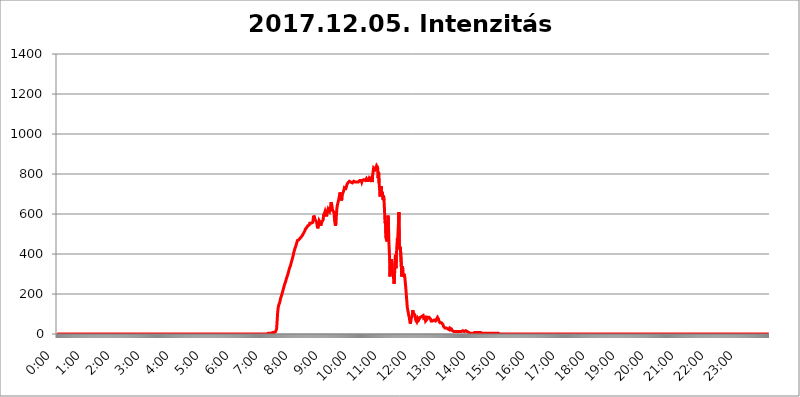
| Category | 2017.12.05. Intenzitás [W/m^2] |
|---|---|
| 0.0 | 0 |
| 0.0006944444444444445 | 0 |
| 0.001388888888888889 | 0 |
| 0.0020833333333333333 | 0 |
| 0.002777777777777778 | 0 |
| 0.003472222222222222 | 0 |
| 0.004166666666666667 | 0 |
| 0.004861111111111111 | 0 |
| 0.005555555555555556 | 0 |
| 0.0062499999999999995 | 0 |
| 0.006944444444444444 | 0 |
| 0.007638888888888889 | 0 |
| 0.008333333333333333 | 0 |
| 0.009027777777777779 | 0 |
| 0.009722222222222222 | 0 |
| 0.010416666666666666 | 0 |
| 0.011111111111111112 | 0 |
| 0.011805555555555555 | 0 |
| 0.012499999999999999 | 0 |
| 0.013194444444444444 | 0 |
| 0.013888888888888888 | 0 |
| 0.014583333333333332 | 0 |
| 0.015277777777777777 | 0 |
| 0.015972222222222224 | 0 |
| 0.016666666666666666 | 0 |
| 0.017361111111111112 | 0 |
| 0.018055555555555557 | 0 |
| 0.01875 | 0 |
| 0.019444444444444445 | 0 |
| 0.02013888888888889 | 0 |
| 0.020833333333333332 | 0 |
| 0.02152777777777778 | 0 |
| 0.022222222222222223 | 0 |
| 0.02291666666666667 | 0 |
| 0.02361111111111111 | 0 |
| 0.024305555555555556 | 0 |
| 0.024999999999999998 | 0 |
| 0.025694444444444447 | 0 |
| 0.02638888888888889 | 0 |
| 0.027083333333333334 | 0 |
| 0.027777777777777776 | 0 |
| 0.02847222222222222 | 0 |
| 0.029166666666666664 | 0 |
| 0.029861111111111113 | 0 |
| 0.030555555555555555 | 0 |
| 0.03125 | 0 |
| 0.03194444444444445 | 0 |
| 0.03263888888888889 | 0 |
| 0.03333333333333333 | 0 |
| 0.034027777777777775 | 0 |
| 0.034722222222222224 | 0 |
| 0.035416666666666666 | 0 |
| 0.036111111111111115 | 0 |
| 0.03680555555555556 | 0 |
| 0.0375 | 0 |
| 0.03819444444444444 | 0 |
| 0.03888888888888889 | 0 |
| 0.03958333333333333 | 0 |
| 0.04027777777777778 | 0 |
| 0.04097222222222222 | 0 |
| 0.041666666666666664 | 0 |
| 0.042361111111111106 | 0 |
| 0.04305555555555556 | 0 |
| 0.043750000000000004 | 0 |
| 0.044444444444444446 | 0 |
| 0.04513888888888889 | 0 |
| 0.04583333333333334 | 0 |
| 0.04652777777777778 | 0 |
| 0.04722222222222222 | 0 |
| 0.04791666666666666 | 0 |
| 0.04861111111111111 | 0 |
| 0.049305555555555554 | 0 |
| 0.049999999999999996 | 0 |
| 0.05069444444444445 | 0 |
| 0.051388888888888894 | 0 |
| 0.052083333333333336 | 0 |
| 0.05277777777777778 | 0 |
| 0.05347222222222222 | 0 |
| 0.05416666666666667 | 0 |
| 0.05486111111111111 | 0 |
| 0.05555555555555555 | 0 |
| 0.05625 | 0 |
| 0.05694444444444444 | 0 |
| 0.057638888888888885 | 0 |
| 0.05833333333333333 | 0 |
| 0.05902777777777778 | 0 |
| 0.059722222222222225 | 0 |
| 0.06041666666666667 | 0 |
| 0.061111111111111116 | 0 |
| 0.06180555555555556 | 0 |
| 0.0625 | 0 |
| 0.06319444444444444 | 0 |
| 0.06388888888888888 | 0 |
| 0.06458333333333334 | 0 |
| 0.06527777777777778 | 0 |
| 0.06597222222222222 | 0 |
| 0.06666666666666667 | 0 |
| 0.06736111111111111 | 0 |
| 0.06805555555555555 | 0 |
| 0.06874999999999999 | 0 |
| 0.06944444444444443 | 0 |
| 0.07013888888888889 | 0 |
| 0.07083333333333333 | 0 |
| 0.07152777777777779 | 0 |
| 0.07222222222222223 | 0 |
| 0.07291666666666667 | 0 |
| 0.07361111111111111 | 0 |
| 0.07430555555555556 | 0 |
| 0.075 | 0 |
| 0.07569444444444444 | 0 |
| 0.0763888888888889 | 0 |
| 0.07708333333333334 | 0 |
| 0.07777777777777778 | 0 |
| 0.07847222222222222 | 0 |
| 0.07916666666666666 | 0 |
| 0.0798611111111111 | 0 |
| 0.08055555555555556 | 0 |
| 0.08125 | 0 |
| 0.08194444444444444 | 0 |
| 0.08263888888888889 | 0 |
| 0.08333333333333333 | 0 |
| 0.08402777777777777 | 0 |
| 0.08472222222222221 | 0 |
| 0.08541666666666665 | 0 |
| 0.08611111111111112 | 0 |
| 0.08680555555555557 | 0 |
| 0.08750000000000001 | 0 |
| 0.08819444444444445 | 0 |
| 0.08888888888888889 | 0 |
| 0.08958333333333333 | 0 |
| 0.09027777777777778 | 0 |
| 0.09097222222222222 | 0 |
| 0.09166666666666667 | 0 |
| 0.09236111111111112 | 0 |
| 0.09305555555555556 | 0 |
| 0.09375 | 0 |
| 0.09444444444444444 | 0 |
| 0.09513888888888888 | 0 |
| 0.09583333333333333 | 0 |
| 0.09652777777777777 | 0 |
| 0.09722222222222222 | 0 |
| 0.09791666666666667 | 0 |
| 0.09861111111111111 | 0 |
| 0.09930555555555555 | 0 |
| 0.09999999999999999 | 0 |
| 0.10069444444444443 | 0 |
| 0.1013888888888889 | 0 |
| 0.10208333333333335 | 0 |
| 0.10277777777777779 | 0 |
| 0.10347222222222223 | 0 |
| 0.10416666666666667 | 0 |
| 0.10486111111111111 | 0 |
| 0.10555555555555556 | 0 |
| 0.10625 | 0 |
| 0.10694444444444444 | 0 |
| 0.1076388888888889 | 0 |
| 0.10833333333333334 | 0 |
| 0.10902777777777778 | 0 |
| 0.10972222222222222 | 0 |
| 0.1111111111111111 | 0 |
| 0.11180555555555556 | 0 |
| 0.11180555555555556 | 0 |
| 0.1125 | 0 |
| 0.11319444444444444 | 0 |
| 0.11388888888888889 | 0 |
| 0.11458333333333333 | 0 |
| 0.11527777777777777 | 0 |
| 0.11597222222222221 | 0 |
| 0.11666666666666665 | 0 |
| 0.1173611111111111 | 0 |
| 0.11805555555555557 | 0 |
| 0.11944444444444445 | 0 |
| 0.12013888888888889 | 0 |
| 0.12083333333333333 | 0 |
| 0.12152777777777778 | 0 |
| 0.12222222222222223 | 0 |
| 0.12291666666666667 | 0 |
| 0.12291666666666667 | 0 |
| 0.12361111111111112 | 0 |
| 0.12430555555555556 | 0 |
| 0.125 | 0 |
| 0.12569444444444444 | 0 |
| 0.12638888888888888 | 0 |
| 0.12708333333333333 | 0 |
| 0.16875 | 0 |
| 0.12847222222222224 | 0 |
| 0.12916666666666668 | 0 |
| 0.12986111111111112 | 0 |
| 0.13055555555555556 | 0 |
| 0.13125 | 0 |
| 0.13194444444444445 | 0 |
| 0.1326388888888889 | 0 |
| 0.13333333333333333 | 0 |
| 0.13402777777777777 | 0 |
| 0.13402777777777777 | 0 |
| 0.13472222222222222 | 0 |
| 0.13541666666666666 | 0 |
| 0.1361111111111111 | 0 |
| 0.13749999999999998 | 0 |
| 0.13819444444444443 | 0 |
| 0.1388888888888889 | 0 |
| 0.13958333333333334 | 0 |
| 0.14027777777777778 | 0 |
| 0.14097222222222222 | 0 |
| 0.14166666666666666 | 0 |
| 0.1423611111111111 | 0 |
| 0.14305555555555557 | 0 |
| 0.14375000000000002 | 0 |
| 0.14444444444444446 | 0 |
| 0.1451388888888889 | 0 |
| 0.1451388888888889 | 0 |
| 0.14652777777777778 | 0 |
| 0.14722222222222223 | 0 |
| 0.14791666666666667 | 0 |
| 0.1486111111111111 | 0 |
| 0.14930555555555555 | 0 |
| 0.15 | 0 |
| 0.15069444444444444 | 0 |
| 0.15138888888888888 | 0 |
| 0.15208333333333332 | 0 |
| 0.15277777777777776 | 0 |
| 0.15347222222222223 | 0 |
| 0.15416666666666667 | 0 |
| 0.15486111111111112 | 0 |
| 0.15555555555555556 | 0 |
| 0.15625 | 0 |
| 0.15694444444444444 | 0 |
| 0.15763888888888888 | 0 |
| 0.15833333333333333 | 0 |
| 0.15902777777777777 | 0 |
| 0.15972222222222224 | 0 |
| 0.16041666666666668 | 0 |
| 0.16111111111111112 | 0 |
| 0.16180555555555556 | 0 |
| 0.1625 | 0 |
| 0.16319444444444445 | 0 |
| 0.1638888888888889 | 0 |
| 0.16458333333333333 | 0 |
| 0.16527777777777777 | 0 |
| 0.16597222222222222 | 0 |
| 0.16666666666666666 | 0 |
| 0.1673611111111111 | 0 |
| 0.16805555555555554 | 0 |
| 0.16874999999999998 | 0 |
| 0.16944444444444443 | 0 |
| 0.17013888888888887 | 0 |
| 0.1708333333333333 | 0 |
| 0.17152777777777775 | 0 |
| 0.17222222222222225 | 0 |
| 0.1729166666666667 | 0 |
| 0.17361111111111113 | 0 |
| 0.17430555555555557 | 0 |
| 0.17500000000000002 | 0 |
| 0.17569444444444446 | 0 |
| 0.1763888888888889 | 0 |
| 0.17708333333333334 | 0 |
| 0.17777777777777778 | 0 |
| 0.17847222222222223 | 0 |
| 0.17916666666666667 | 0 |
| 0.1798611111111111 | 0 |
| 0.18055555555555555 | 0 |
| 0.18125 | 0 |
| 0.18194444444444444 | 0 |
| 0.1826388888888889 | 0 |
| 0.18333333333333335 | 0 |
| 0.1840277777777778 | 0 |
| 0.18472222222222223 | 0 |
| 0.18541666666666667 | 0 |
| 0.18611111111111112 | 0 |
| 0.18680555555555556 | 0 |
| 0.1875 | 0 |
| 0.18819444444444444 | 0 |
| 0.18888888888888888 | 0 |
| 0.18958333333333333 | 0 |
| 0.19027777777777777 | 0 |
| 0.1909722222222222 | 0 |
| 0.19166666666666665 | 0 |
| 0.19236111111111112 | 0 |
| 0.19305555555555554 | 0 |
| 0.19375 | 0 |
| 0.19444444444444445 | 0 |
| 0.1951388888888889 | 0 |
| 0.19583333333333333 | 0 |
| 0.19652777777777777 | 0 |
| 0.19722222222222222 | 0 |
| 0.19791666666666666 | 0 |
| 0.1986111111111111 | 0 |
| 0.19930555555555554 | 0 |
| 0.19999999999999998 | 0 |
| 0.20069444444444443 | 0 |
| 0.20138888888888887 | 0 |
| 0.2020833333333333 | 0 |
| 0.2027777777777778 | 0 |
| 0.2034722222222222 | 0 |
| 0.2041666666666667 | 0 |
| 0.20486111111111113 | 0 |
| 0.20555555555555557 | 0 |
| 0.20625000000000002 | 0 |
| 0.20694444444444446 | 0 |
| 0.2076388888888889 | 0 |
| 0.20833333333333334 | 0 |
| 0.20902777777777778 | 0 |
| 0.20972222222222223 | 0 |
| 0.21041666666666667 | 0 |
| 0.2111111111111111 | 0 |
| 0.21180555555555555 | 0 |
| 0.2125 | 0 |
| 0.21319444444444444 | 0 |
| 0.2138888888888889 | 0 |
| 0.21458333333333335 | 0 |
| 0.2152777777777778 | 0 |
| 0.21597222222222223 | 0 |
| 0.21666666666666667 | 0 |
| 0.21736111111111112 | 0 |
| 0.21805555555555556 | 0 |
| 0.21875 | 0 |
| 0.21944444444444444 | 0 |
| 0.22013888888888888 | 0 |
| 0.22083333333333333 | 0 |
| 0.22152777777777777 | 0 |
| 0.2222222222222222 | 0 |
| 0.22291666666666665 | 0 |
| 0.2236111111111111 | 0 |
| 0.22430555555555556 | 0 |
| 0.225 | 0 |
| 0.22569444444444445 | 0 |
| 0.2263888888888889 | 0 |
| 0.22708333333333333 | 0 |
| 0.22777777777777777 | 0 |
| 0.22847222222222222 | 0 |
| 0.22916666666666666 | 0 |
| 0.2298611111111111 | 0 |
| 0.23055555555555554 | 0 |
| 0.23124999999999998 | 0 |
| 0.23194444444444443 | 0 |
| 0.23263888888888887 | 0 |
| 0.2333333333333333 | 0 |
| 0.2340277777777778 | 0 |
| 0.2347222222222222 | 0 |
| 0.2354166666666667 | 0 |
| 0.23611111111111113 | 0 |
| 0.23680555555555557 | 0 |
| 0.23750000000000002 | 0 |
| 0.23819444444444446 | 0 |
| 0.2388888888888889 | 0 |
| 0.23958333333333334 | 0 |
| 0.24027777777777778 | 0 |
| 0.24097222222222223 | 0 |
| 0.24166666666666667 | 0 |
| 0.2423611111111111 | 0 |
| 0.24305555555555555 | 0 |
| 0.24375 | 0 |
| 0.24444444444444446 | 0 |
| 0.24513888888888888 | 0 |
| 0.24583333333333335 | 0 |
| 0.2465277777777778 | 0 |
| 0.24722222222222223 | 0 |
| 0.24791666666666667 | 0 |
| 0.24861111111111112 | 0 |
| 0.24930555555555556 | 0 |
| 0.25 | 0 |
| 0.25069444444444444 | 0 |
| 0.2513888888888889 | 0 |
| 0.2520833333333333 | 0 |
| 0.25277777777777777 | 0 |
| 0.2534722222222222 | 0 |
| 0.25416666666666665 | 0 |
| 0.2548611111111111 | 0 |
| 0.2555555555555556 | 0 |
| 0.25625000000000003 | 0 |
| 0.2569444444444445 | 0 |
| 0.2576388888888889 | 0 |
| 0.25833333333333336 | 0 |
| 0.2590277777777778 | 0 |
| 0.25972222222222224 | 0 |
| 0.2604166666666667 | 0 |
| 0.2611111111111111 | 0 |
| 0.26180555555555557 | 0 |
| 0.2625 | 0 |
| 0.26319444444444445 | 0 |
| 0.2638888888888889 | 0 |
| 0.26458333333333334 | 0 |
| 0.2652777777777778 | 0 |
| 0.2659722222222222 | 0 |
| 0.26666666666666666 | 0 |
| 0.2673611111111111 | 0 |
| 0.26805555555555555 | 0 |
| 0.26875 | 0 |
| 0.26944444444444443 | 0 |
| 0.2701388888888889 | 0 |
| 0.2708333333333333 | 0 |
| 0.27152777777777776 | 0 |
| 0.2722222222222222 | 0 |
| 0.27291666666666664 | 0 |
| 0.2736111111111111 | 0 |
| 0.2743055555555555 | 0 |
| 0.27499999999999997 | 0 |
| 0.27569444444444446 | 0 |
| 0.27638888888888885 | 0 |
| 0.27708333333333335 | 0 |
| 0.2777777777777778 | 0 |
| 0.27847222222222223 | 0 |
| 0.2791666666666667 | 0 |
| 0.2798611111111111 | 0 |
| 0.28055555555555556 | 0 |
| 0.28125 | 0 |
| 0.28194444444444444 | 0 |
| 0.2826388888888889 | 0 |
| 0.2833333333333333 | 0 |
| 0.28402777777777777 | 0 |
| 0.2847222222222222 | 0 |
| 0.28541666666666665 | 0 |
| 0.28611111111111115 | 0 |
| 0.28680555555555554 | 0 |
| 0.28750000000000003 | 0 |
| 0.2881944444444445 | 0 |
| 0.2888888888888889 | 0 |
| 0.28958333333333336 | 0 |
| 0.2902777777777778 | 0 |
| 0.29097222222222224 | 0 |
| 0.2916666666666667 | 0 |
| 0.2923611111111111 | 0 |
| 0.29305555555555557 | 0 |
| 0.29375 | 0 |
| 0.29444444444444445 | 0 |
| 0.2951388888888889 | 3.525 |
| 0.29583333333333334 | 3.525 |
| 0.2965277777777778 | 3.525 |
| 0.2972222222222222 | 3.525 |
| 0.29791666666666666 | 3.525 |
| 0.2986111111111111 | 3.525 |
| 0.29930555555555555 | 3.525 |
| 0.3 | 3.525 |
| 0.30069444444444443 | 3.525 |
| 0.3013888888888889 | 7.887 |
| 0.3020833333333333 | 7.887 |
| 0.30277777777777776 | 7.887 |
| 0.3034722222222222 | 7.887 |
| 0.30416666666666664 | 7.887 |
| 0.3048611111111111 | 12.257 |
| 0.3055555555555555 | 12.257 |
| 0.30624999999999997 | 12.257 |
| 0.3069444444444444 | 12.257 |
| 0.3076388888888889 | 25.419 |
| 0.30833333333333335 | 60.85 |
| 0.3090277777777778 | 101.184 |
| 0.30972222222222223 | 128.284 |
| 0.3104166666666667 | 141.884 |
| 0.3111111111111111 | 146.423 |
| 0.31180555555555556 | 155.509 |
| 0.3125 | 164.605 |
| 0.31319444444444444 | 178.264 |
| 0.3138888888888889 | 182.82 |
| 0.3145833333333333 | 191.937 |
| 0.31527777777777777 | 201.058 |
| 0.3159722222222222 | 210.182 |
| 0.31666666666666665 | 214.746 |
| 0.31736111111111115 | 228.436 |
| 0.31805555555555554 | 237.564 |
| 0.31875000000000003 | 246.689 |
| 0.3194444444444445 | 251.251 |
| 0.3201388888888889 | 260.373 |
| 0.32083333333333336 | 269.49 |
| 0.3215277777777778 | 278.603 |
| 0.32222222222222224 | 283.156 |
| 0.3229166666666667 | 292.259 |
| 0.3236111111111111 | 301.354 |
| 0.32430555555555557 | 310.44 |
| 0.325 | 319.517 |
| 0.32569444444444445 | 328.584 |
| 0.3263888888888889 | 333.113 |
| 0.32708333333333334 | 342.162 |
| 0.3277777777777778 | 351.198 |
| 0.3284722222222222 | 360.221 |
| 0.32916666666666666 | 364.728 |
| 0.3298611111111111 | 378.224 |
| 0.33055555555555555 | 387.202 |
| 0.33125 | 391.685 |
| 0.33194444444444443 | 409.574 |
| 0.3326388888888889 | 414.035 |
| 0.3333333333333333 | 427.39 |
| 0.3340277777777778 | 431.833 |
| 0.3347222222222222 | 440.702 |
| 0.3354166666666667 | 449.551 |
| 0.3361111111111111 | 458.38 |
| 0.3368055555555556 | 467.187 |
| 0.33749999999999997 | 471.582 |
| 0.33819444444444446 | 471.582 |
| 0.33888888888888885 | 471.582 |
| 0.33958333333333335 | 475.972 |
| 0.34027777777777773 | 475.972 |
| 0.34097222222222223 | 480.356 |
| 0.3416666666666666 | 480.356 |
| 0.3423611111111111 | 480.356 |
| 0.3430555555555555 | 489.108 |
| 0.34375 | 493.475 |
| 0.3444444444444445 | 497.836 |
| 0.3451388888888889 | 502.192 |
| 0.3458333333333334 | 506.542 |
| 0.34652777777777777 | 510.885 |
| 0.34722222222222227 | 515.223 |
| 0.34791666666666665 | 523.88 |
| 0.34861111111111115 | 523.88 |
| 0.34930555555555554 | 528.2 |
| 0.35000000000000003 | 532.513 |
| 0.3506944444444444 | 536.82 |
| 0.3513888888888889 | 541.121 |
| 0.3520833333333333 | 545.416 |
| 0.3527777777777778 | 545.416 |
| 0.3534722222222222 | 545.416 |
| 0.3541666666666667 | 553.986 |
| 0.3548611111111111 | 553.986 |
| 0.35555555555555557 | 553.986 |
| 0.35625 | 553.986 |
| 0.35694444444444445 | 549.704 |
| 0.3576388888888889 | 553.986 |
| 0.35833333333333334 | 558.261 |
| 0.3590277777777778 | 575.299 |
| 0.3597222222222222 | 592.233 |
| 0.36041666666666666 | 588.009 |
| 0.3611111111111111 | 579.542 |
| 0.36180555555555555 | 571.049 |
| 0.3625 | 575.299 |
| 0.36319444444444443 | 566.793 |
| 0.3638888888888889 | 558.261 |
| 0.3645833333333333 | 541.121 |
| 0.3652777777777778 | 528.2 |
| 0.3659722222222222 | 532.513 |
| 0.3666666666666667 | 549.704 |
| 0.3673611111111111 | 566.793 |
| 0.3680555555555556 | 566.793 |
| 0.36874999999999997 | 558.261 |
| 0.36944444444444446 | 541.121 |
| 0.37013888888888885 | 545.416 |
| 0.37083333333333335 | 558.261 |
| 0.37152777777777773 | 553.986 |
| 0.37222222222222223 | 558.261 |
| 0.3729166666666666 | 571.049 |
| 0.3736111111111111 | 596.45 |
| 0.3743055555555555 | 596.45 |
| 0.375 | 604.864 |
| 0.3756944444444445 | 613.252 |
| 0.3763888888888889 | 617.436 |
| 0.3770833333333334 | 596.45 |
| 0.37777777777777777 | 588.009 |
| 0.37847222222222227 | 609.062 |
| 0.37916666666666665 | 617.436 |
| 0.37986111111111115 | 625.784 |
| 0.38055555555555554 | 629.948 |
| 0.38125000000000003 | 629.948 |
| 0.3819444444444444 | 613.252 |
| 0.3826388888888889 | 613.252 |
| 0.3833333333333333 | 634.105 |
| 0.3840277777777778 | 658.909 |
| 0.3847222222222222 | 650.667 |
| 0.3854166666666667 | 638.256 |
| 0.3861111111111111 | 617.436 |
| 0.38680555555555557 | 613.252 |
| 0.3875 | 617.436 |
| 0.38819444444444445 | 609.062 |
| 0.3888888888888889 | 571.049 |
| 0.38958333333333334 | 553.986 |
| 0.3902777777777778 | 541.121 |
| 0.3909722222222222 | 558.261 |
| 0.39166666666666666 | 604.864 |
| 0.3923611111111111 | 634.105 |
| 0.39305555555555555 | 646.537 |
| 0.39375 | 650.667 |
| 0.39444444444444443 | 667.123 |
| 0.3951388888888889 | 679.395 |
| 0.3958333333333333 | 691.608 |
| 0.3965277777777778 | 707.8 |
| 0.3972222222222222 | 695.666 |
| 0.3979166666666667 | 679.395 |
| 0.3986111111111111 | 667.123 |
| 0.3993055555555556 | 679.395 |
| 0.39999999999999997 | 699.717 |
| 0.40069444444444446 | 703.762 |
| 0.40138888888888885 | 711.832 |
| 0.40208333333333335 | 719.877 |
| 0.40277777777777773 | 731.896 |
| 0.40347222222222223 | 735.89 |
| 0.4041666666666666 | 731.896 |
| 0.4048611111111111 | 727.896 |
| 0.4055555555555555 | 735.89 |
| 0.40625 | 747.834 |
| 0.4069444444444445 | 751.803 |
| 0.4076388888888889 | 755.766 |
| 0.4083333333333334 | 759.723 |
| 0.40902777777777777 | 759.723 |
| 0.40972222222222227 | 763.674 |
| 0.41041666666666665 | 759.723 |
| 0.41111111111111115 | 759.723 |
| 0.41180555555555554 | 759.723 |
| 0.41250000000000003 | 759.723 |
| 0.4131944444444444 | 755.766 |
| 0.4138888888888889 | 755.766 |
| 0.4145833333333333 | 759.723 |
| 0.4152777777777778 | 759.723 |
| 0.4159722222222222 | 763.674 |
| 0.4166666666666667 | 763.674 |
| 0.4173611111111111 | 759.723 |
| 0.41805555555555557 | 759.723 |
| 0.41875 | 759.723 |
| 0.41944444444444445 | 759.723 |
| 0.4201388888888889 | 759.723 |
| 0.42083333333333334 | 763.674 |
| 0.4215277777777778 | 759.723 |
| 0.4222222222222222 | 759.723 |
| 0.42291666666666666 | 763.674 |
| 0.4236111111111111 | 763.674 |
| 0.42430555555555555 | 767.62 |
| 0.425 | 767.62 |
| 0.42569444444444443 | 763.674 |
| 0.4263888888888889 | 767.62 |
| 0.4270833333333333 | 759.723 |
| 0.4277777777777778 | 767.62 |
| 0.4284722222222222 | 767.62 |
| 0.4291666666666667 | 767.62 |
| 0.4298611111111111 | 771.559 |
| 0.4305555555555556 | 771.559 |
| 0.43124999999999997 | 771.559 |
| 0.43194444444444446 | 767.62 |
| 0.43263888888888885 | 763.674 |
| 0.43333333333333335 | 775.492 |
| 0.43402777777777773 | 767.62 |
| 0.43472222222222223 | 771.559 |
| 0.4354166666666666 | 767.62 |
| 0.4361111111111111 | 767.62 |
| 0.4368055555555555 | 771.559 |
| 0.4375 | 779.42 |
| 0.4381944444444445 | 779.42 |
| 0.4388888888888889 | 771.559 |
| 0.4395833333333334 | 771.559 |
| 0.44027777777777777 | 779.42 |
| 0.44097222222222227 | 783.342 |
| 0.44166666666666665 | 759.723 |
| 0.44236111111111115 | 795.074 |
| 0.44305555555555554 | 791.169 |
| 0.44375000000000003 | 829.981 |
| 0.4444444444444444 | 833.834 |
| 0.4451388888888889 | 829.981 |
| 0.4458333333333333 | 822.26 |
| 0.4465277777777778 | 826.123 |
| 0.4472222222222222 | 833.834 |
| 0.4479166666666667 | 841.526 |
| 0.4486111111111111 | 845.365 |
| 0.44930555555555557 | 833.834 |
| 0.45 | 779.42 |
| 0.45069444444444445 | 810.641 |
| 0.4513888888888889 | 755.766 |
| 0.45208333333333334 | 723.889 |
| 0.4527777777777778 | 687.544 |
| 0.4534722222222222 | 683.473 |
| 0.45416666666666666 | 739.877 |
| 0.4548611111111111 | 703.762 |
| 0.45555555555555555 | 711.832 |
| 0.45625 | 695.666 |
| 0.45694444444444443 | 671.22 |
| 0.4576388888888889 | 691.608 |
| 0.4583333333333333 | 667.123 |
| 0.4590277777777778 | 617.436 |
| 0.4597222222222222 | 553.986 |
| 0.4604166666666667 | 562.53 |
| 0.4611111111111111 | 480.356 |
| 0.4618055555555556 | 471.582 |
| 0.46249999999999997 | 462.786 |
| 0.46319444444444446 | 497.836 |
| 0.46388888888888885 | 592.233 |
| 0.46458333333333335 | 541.121 |
| 0.46527777777777773 | 449.551 |
| 0.46597222222222223 | 396.164 |
| 0.4666666666666666 | 287.709 |
| 0.4673611111111111 | 351.198 |
| 0.4680555555555555 | 364.728 |
| 0.46875 | 373.729 |
| 0.4694444444444445 | 346.682 |
| 0.4701388888888889 | 310.44 |
| 0.4708333333333334 | 305.898 |
| 0.47152777777777777 | 287.709 |
| 0.47222222222222227 | 251.251 |
| 0.47291666666666665 | 264.932 |
| 0.47361111111111115 | 364.728 |
| 0.47430555555555554 | 396.164 |
| 0.47500000000000003 | 328.584 |
| 0.4756944444444444 | 396.164 |
| 0.4763888888888889 | 440.702 |
| 0.4770833333333333 | 480.356 |
| 0.4777777777777778 | 458.38 |
| 0.4784722222222222 | 462.786 |
| 0.4791666666666667 | 609.062 |
| 0.4798611111111111 | 436.27 |
| 0.48055555555555557 | 422.943 |
| 0.48125 | 436.27 |
| 0.48194444444444445 | 431.833 |
| 0.4826388888888889 | 431.833 |
| 0.48333333333333334 | 287.709 |
| 0.4840277777777778 | 337.639 |
| 0.4847222222222222 | 324.052 |
| 0.48541666666666666 | 287.709 |
| 0.4861111111111111 | 301.354 |
| 0.48680555555555555 | 296.808 |
| 0.4875 | 283.156 |
| 0.48819444444444443 | 255.813 |
| 0.4888888888888889 | 228.436 |
| 0.4895833333333333 | 196.497 |
| 0.4902777777777778 | 164.605 |
| 0.4909722222222222 | 132.814 |
| 0.4916666666666667 | 128.284 |
| 0.4923611111111111 | 128.284 |
| 0.4930555555555556 | 92.184 |
| 0.49374999999999997 | 83.205 |
| 0.49444444444444446 | 65.31 |
| 0.49513888888888885 | 51.951 |
| 0.49583333333333335 | 65.31 |
| 0.49652777777777773 | 78.722 |
| 0.49722222222222223 | 83.205 |
| 0.4979166666666666 | 92.184 |
| 0.4986111111111111 | 119.235 |
| 0.4993055555555555 | 105.69 |
| 0.5 | 105.69 |
| 0.5006944444444444 | 101.184 |
| 0.5013888888888889 | 96.682 |
| 0.5020833333333333 | 83.205 |
| 0.5027777777777778 | 69.775 |
| 0.5034722222222222 | 69.775 |
| 0.5041666666666667 | 60.85 |
| 0.5048611111111111 | 65.31 |
| 0.5055555555555555 | 78.722 |
| 0.50625 | 83.205 |
| 0.5069444444444444 | 69.775 |
| 0.5076388888888889 | 65.31 |
| 0.5083333333333333 | 74.246 |
| 0.5090277777777777 | 83.205 |
| 0.5097222222222222 | 87.692 |
| 0.5104166666666666 | 83.205 |
| 0.5111111111111112 | 87.692 |
| 0.5118055555555555 | 92.184 |
| 0.5125000000000001 | 92.184 |
| 0.5131944444444444 | 92.184 |
| 0.513888888888889 | 78.722 |
| 0.5145833333333333 | 74.246 |
| 0.5152777777777778 | 83.205 |
| 0.5159722222222222 | 83.205 |
| 0.5166666666666667 | 65.31 |
| 0.517361111111111 | 65.31 |
| 0.5180555555555556 | 69.775 |
| 0.5187499999999999 | 74.246 |
| 0.5194444444444445 | 83.205 |
| 0.5201388888888888 | 83.205 |
| 0.5208333333333334 | 83.205 |
| 0.5215277777777778 | 83.205 |
| 0.5222222222222223 | 83.205 |
| 0.5229166666666667 | 78.722 |
| 0.5236111111111111 | 74.246 |
| 0.5243055555555556 | 65.31 |
| 0.525 | 60.85 |
| 0.5256944444444445 | 60.85 |
| 0.5263888888888889 | 65.31 |
| 0.5270833333333333 | 69.775 |
| 0.5277777777777778 | 69.775 |
| 0.5284722222222222 | 69.775 |
| 0.5291666666666667 | 65.31 |
| 0.5298611111111111 | 65.31 |
| 0.5305555555555556 | 65.31 |
| 0.53125 | 69.775 |
| 0.5319444444444444 | 74.246 |
| 0.5326388888888889 | 78.722 |
| 0.5333333333333333 | 83.205 |
| 0.5340277777777778 | 83.205 |
| 0.5347222222222222 | 74.246 |
| 0.5354166666666667 | 65.31 |
| 0.5361111111111111 | 60.85 |
| 0.5368055555555555 | 56.398 |
| 0.5375 | 56.398 |
| 0.5381944444444444 | 56.398 |
| 0.5388888888888889 | 56.398 |
| 0.5395833333333333 | 56.398 |
| 0.5402777777777777 | 51.951 |
| 0.5409722222222222 | 47.511 |
| 0.5416666666666666 | 38.653 |
| 0.5423611111111112 | 38.653 |
| 0.5430555555555555 | 34.234 |
| 0.5437500000000001 | 29.823 |
| 0.5444444444444444 | 29.823 |
| 0.545138888888889 | 29.823 |
| 0.5458333333333333 | 29.823 |
| 0.5465277777777778 | 25.419 |
| 0.5472222222222222 | 25.419 |
| 0.5479166666666667 | 25.419 |
| 0.548611111111111 | 25.419 |
| 0.5493055555555556 | 25.419 |
| 0.5499999999999999 | 21.024 |
| 0.5506944444444445 | 29.823 |
| 0.5513888888888888 | 25.419 |
| 0.5520833333333334 | 25.419 |
| 0.5527777777777778 | 25.419 |
| 0.5534722222222223 | 21.024 |
| 0.5541666666666667 | 16.636 |
| 0.5548611111111111 | 16.636 |
| 0.5555555555555556 | 12.257 |
| 0.55625 | 12.257 |
| 0.5569444444444445 | 12.257 |
| 0.5576388888888889 | 12.257 |
| 0.5583333333333333 | 12.257 |
| 0.5590277777777778 | 12.257 |
| 0.5597222222222222 | 12.257 |
| 0.5604166666666667 | 12.257 |
| 0.5611111111111111 | 12.257 |
| 0.5618055555555556 | 12.257 |
| 0.5625 | 12.257 |
| 0.5631944444444444 | 12.257 |
| 0.5638888888888889 | 12.257 |
| 0.5645833333333333 | 12.257 |
| 0.5652777777777778 | 12.257 |
| 0.5659722222222222 | 12.257 |
| 0.5666666666666667 | 12.257 |
| 0.5673611111111111 | 12.257 |
| 0.5680555555555555 | 12.257 |
| 0.56875 | 16.636 |
| 0.5694444444444444 | 12.257 |
| 0.5701388888888889 | 12.257 |
| 0.5708333333333333 | 12.257 |
| 0.5715277777777777 | 12.257 |
| 0.5722222222222222 | 12.257 |
| 0.5729166666666666 | 16.636 |
| 0.5736111111111112 | 12.257 |
| 0.5743055555555555 | 12.257 |
| 0.5750000000000001 | 12.257 |
| 0.5756944444444444 | 12.257 |
| 0.576388888888889 | 12.257 |
| 0.5770833333333333 | 7.887 |
| 0.5777777777777778 | 7.887 |
| 0.5784722222222222 | 7.887 |
| 0.5791666666666667 | 3.525 |
| 0.579861111111111 | 3.525 |
| 0.5805555555555556 | 3.525 |
| 0.5812499999999999 | 3.525 |
| 0.5819444444444445 | 3.525 |
| 0.5826388888888888 | 3.525 |
| 0.5833333333333334 | 3.525 |
| 0.5840277777777778 | 3.525 |
| 0.5847222222222223 | 3.525 |
| 0.5854166666666667 | 7.887 |
| 0.5861111111111111 | 7.887 |
| 0.5868055555555556 | 7.887 |
| 0.5875 | 7.887 |
| 0.5881944444444445 | 7.887 |
| 0.5888888888888889 | 7.887 |
| 0.5895833333333333 | 7.887 |
| 0.5902777777777778 | 7.887 |
| 0.5909722222222222 | 7.887 |
| 0.5916666666666667 | 7.887 |
| 0.5923611111111111 | 7.887 |
| 0.5930555555555556 | 7.887 |
| 0.59375 | 7.887 |
| 0.5944444444444444 | 7.887 |
| 0.5951388888888889 | 7.887 |
| 0.5958333333333333 | 3.525 |
| 0.5965277777777778 | 3.525 |
| 0.5972222222222222 | 3.525 |
| 0.5979166666666667 | 3.525 |
| 0.5986111111111111 | 3.525 |
| 0.5993055555555555 | 3.525 |
| 0.6 | 3.525 |
| 0.6006944444444444 | 3.525 |
| 0.6013888888888889 | 3.525 |
| 0.6020833333333333 | 3.525 |
| 0.6027777777777777 | 3.525 |
| 0.6034722222222222 | 3.525 |
| 0.6041666666666666 | 3.525 |
| 0.6048611111111112 | 3.525 |
| 0.6055555555555555 | 3.525 |
| 0.6062500000000001 | 3.525 |
| 0.6069444444444444 | 3.525 |
| 0.607638888888889 | 3.525 |
| 0.6083333333333333 | 3.525 |
| 0.6090277777777778 | 3.525 |
| 0.6097222222222222 | 3.525 |
| 0.6104166666666667 | 3.525 |
| 0.611111111111111 | 3.525 |
| 0.6118055555555556 | 3.525 |
| 0.6124999999999999 | 3.525 |
| 0.6131944444444445 | 3.525 |
| 0.6138888888888888 | 3.525 |
| 0.6145833333333334 | 3.525 |
| 0.6152777777777778 | 3.525 |
| 0.6159722222222223 | 3.525 |
| 0.6166666666666667 | 3.525 |
| 0.6173611111111111 | 3.525 |
| 0.6180555555555556 | 3.525 |
| 0.61875 | 3.525 |
| 0.6194444444444445 | 3.525 |
| 0.6201388888888889 | 3.525 |
| 0.6208333333333333 | 0 |
| 0.6215277777777778 | 0 |
| 0.6222222222222222 | 3.525 |
| 0.6229166666666667 | 0 |
| 0.6236111111111111 | 0 |
| 0.6243055555555556 | 0 |
| 0.625 | 0 |
| 0.6256944444444444 | 0 |
| 0.6263888888888889 | 0 |
| 0.6270833333333333 | 0 |
| 0.6277777777777778 | 0 |
| 0.6284722222222222 | 0 |
| 0.6291666666666667 | 0 |
| 0.6298611111111111 | 0 |
| 0.6305555555555555 | 0 |
| 0.63125 | 0 |
| 0.6319444444444444 | 0 |
| 0.6326388888888889 | 0 |
| 0.6333333333333333 | 0 |
| 0.6340277777777777 | 0 |
| 0.6347222222222222 | 0 |
| 0.6354166666666666 | 0 |
| 0.6361111111111112 | 0 |
| 0.6368055555555555 | 0 |
| 0.6375000000000001 | 0 |
| 0.6381944444444444 | 0 |
| 0.638888888888889 | 0 |
| 0.6395833333333333 | 0 |
| 0.6402777777777778 | 0 |
| 0.6409722222222222 | 0 |
| 0.6416666666666667 | 0 |
| 0.642361111111111 | 0 |
| 0.6430555555555556 | 0 |
| 0.6437499999999999 | 0 |
| 0.6444444444444445 | 0 |
| 0.6451388888888888 | 0 |
| 0.6458333333333334 | 0 |
| 0.6465277777777778 | 0 |
| 0.6472222222222223 | 0 |
| 0.6479166666666667 | 0 |
| 0.6486111111111111 | 0 |
| 0.6493055555555556 | 0 |
| 0.65 | 0 |
| 0.6506944444444445 | 0 |
| 0.6513888888888889 | 0 |
| 0.6520833333333333 | 0 |
| 0.6527777777777778 | 0 |
| 0.6534722222222222 | 0 |
| 0.6541666666666667 | 0 |
| 0.6548611111111111 | 0 |
| 0.6555555555555556 | 0 |
| 0.65625 | 0 |
| 0.6569444444444444 | 0 |
| 0.6576388888888889 | 0 |
| 0.6583333333333333 | 0 |
| 0.6590277777777778 | 0 |
| 0.6597222222222222 | 0 |
| 0.6604166666666667 | 0 |
| 0.6611111111111111 | 0 |
| 0.6618055555555555 | 0 |
| 0.6625 | 0 |
| 0.6631944444444444 | 0 |
| 0.6638888888888889 | 0 |
| 0.6645833333333333 | 0 |
| 0.6652777777777777 | 0 |
| 0.6659722222222222 | 0 |
| 0.6666666666666666 | 0 |
| 0.6673611111111111 | 0 |
| 0.6680555555555556 | 0 |
| 0.6687500000000001 | 0 |
| 0.6694444444444444 | 0 |
| 0.6701388888888888 | 0 |
| 0.6708333333333334 | 0 |
| 0.6715277777777778 | 0 |
| 0.6722222222222222 | 0 |
| 0.6729166666666666 | 0 |
| 0.6736111111111112 | 0 |
| 0.6743055555555556 | 0 |
| 0.6749999999999999 | 0 |
| 0.6756944444444444 | 0 |
| 0.6763888888888889 | 0 |
| 0.6770833333333334 | 0 |
| 0.6777777777777777 | 0 |
| 0.6784722222222223 | 0 |
| 0.6791666666666667 | 0 |
| 0.6798611111111111 | 0 |
| 0.6805555555555555 | 0 |
| 0.68125 | 0 |
| 0.6819444444444445 | 0 |
| 0.6826388888888889 | 0 |
| 0.6833333333333332 | 0 |
| 0.6840277777777778 | 0 |
| 0.6847222222222222 | 0 |
| 0.6854166666666667 | 0 |
| 0.686111111111111 | 0 |
| 0.6868055555555556 | 0 |
| 0.6875 | 0 |
| 0.6881944444444444 | 0 |
| 0.688888888888889 | 0 |
| 0.6895833333333333 | 0 |
| 0.6902777777777778 | 0 |
| 0.6909722222222222 | 0 |
| 0.6916666666666668 | 0 |
| 0.6923611111111111 | 0 |
| 0.6930555555555555 | 0 |
| 0.69375 | 0 |
| 0.6944444444444445 | 0 |
| 0.6951388888888889 | 0 |
| 0.6958333333333333 | 0 |
| 0.6965277777777777 | 0 |
| 0.6972222222222223 | 0 |
| 0.6979166666666666 | 0 |
| 0.6986111111111111 | 0 |
| 0.6993055555555556 | 0 |
| 0.7000000000000001 | 0 |
| 0.7006944444444444 | 0 |
| 0.7013888888888888 | 0 |
| 0.7020833333333334 | 0 |
| 0.7027777777777778 | 0 |
| 0.7034722222222222 | 0 |
| 0.7041666666666666 | 0 |
| 0.7048611111111112 | 0 |
| 0.7055555555555556 | 0 |
| 0.7062499999999999 | 0 |
| 0.7069444444444444 | 0 |
| 0.7076388888888889 | 0 |
| 0.7083333333333334 | 0 |
| 0.7090277777777777 | 0 |
| 0.7097222222222223 | 0 |
| 0.7104166666666667 | 0 |
| 0.7111111111111111 | 0 |
| 0.7118055555555555 | 0 |
| 0.7125 | 0 |
| 0.7131944444444445 | 0 |
| 0.7138888888888889 | 0 |
| 0.7145833333333332 | 0 |
| 0.7152777777777778 | 0 |
| 0.7159722222222222 | 0 |
| 0.7166666666666667 | 0 |
| 0.717361111111111 | 0 |
| 0.7180555555555556 | 0 |
| 0.71875 | 0 |
| 0.7194444444444444 | 0 |
| 0.720138888888889 | 0 |
| 0.7208333333333333 | 0 |
| 0.7215277777777778 | 0 |
| 0.7222222222222222 | 0 |
| 0.7229166666666668 | 0 |
| 0.7236111111111111 | 0 |
| 0.7243055555555555 | 0 |
| 0.725 | 0 |
| 0.7256944444444445 | 0 |
| 0.7263888888888889 | 0 |
| 0.7270833333333333 | 0 |
| 0.7277777777777777 | 0 |
| 0.7284722222222223 | 0 |
| 0.7291666666666666 | 0 |
| 0.7298611111111111 | 0 |
| 0.7305555555555556 | 0 |
| 0.7312500000000001 | 0 |
| 0.7319444444444444 | 0 |
| 0.7326388888888888 | 0 |
| 0.7333333333333334 | 0 |
| 0.7340277777777778 | 0 |
| 0.7347222222222222 | 0 |
| 0.7354166666666666 | 0 |
| 0.7361111111111112 | 0 |
| 0.7368055555555556 | 0 |
| 0.7374999999999999 | 0 |
| 0.7381944444444444 | 0 |
| 0.7388888888888889 | 0 |
| 0.7395833333333334 | 0 |
| 0.7402777777777777 | 0 |
| 0.7409722222222223 | 0 |
| 0.7416666666666667 | 0 |
| 0.7423611111111111 | 0 |
| 0.7430555555555555 | 0 |
| 0.74375 | 0 |
| 0.7444444444444445 | 0 |
| 0.7451388888888889 | 0 |
| 0.7458333333333332 | 0 |
| 0.7465277777777778 | 0 |
| 0.7472222222222222 | 0 |
| 0.7479166666666667 | 0 |
| 0.748611111111111 | 0 |
| 0.7493055555555556 | 0 |
| 0.75 | 0 |
| 0.7506944444444444 | 0 |
| 0.751388888888889 | 0 |
| 0.7520833333333333 | 0 |
| 0.7527777777777778 | 0 |
| 0.7534722222222222 | 0 |
| 0.7541666666666668 | 0 |
| 0.7548611111111111 | 0 |
| 0.7555555555555555 | 0 |
| 0.75625 | 0 |
| 0.7569444444444445 | 0 |
| 0.7576388888888889 | 0 |
| 0.7583333333333333 | 0 |
| 0.7590277777777777 | 0 |
| 0.7597222222222223 | 0 |
| 0.7604166666666666 | 0 |
| 0.7611111111111111 | 0 |
| 0.7618055555555556 | 0 |
| 0.7625000000000001 | 0 |
| 0.7631944444444444 | 0 |
| 0.7638888888888888 | 0 |
| 0.7645833333333334 | 0 |
| 0.7652777777777778 | 0 |
| 0.7659722222222222 | 0 |
| 0.7666666666666666 | 0 |
| 0.7673611111111112 | 0 |
| 0.7680555555555556 | 0 |
| 0.7687499999999999 | 0 |
| 0.7694444444444444 | 0 |
| 0.7701388888888889 | 0 |
| 0.7708333333333334 | 0 |
| 0.7715277777777777 | 0 |
| 0.7722222222222223 | 0 |
| 0.7729166666666667 | 0 |
| 0.7736111111111111 | 0 |
| 0.7743055555555555 | 0 |
| 0.775 | 0 |
| 0.7756944444444445 | 0 |
| 0.7763888888888889 | 0 |
| 0.7770833333333332 | 0 |
| 0.7777777777777778 | 0 |
| 0.7784722222222222 | 0 |
| 0.7791666666666667 | 0 |
| 0.779861111111111 | 0 |
| 0.7805555555555556 | 0 |
| 0.78125 | 0 |
| 0.7819444444444444 | 0 |
| 0.782638888888889 | 0 |
| 0.7833333333333333 | 0 |
| 0.7840277777777778 | 0 |
| 0.7847222222222222 | 0 |
| 0.7854166666666668 | 0 |
| 0.7861111111111111 | 0 |
| 0.7868055555555555 | 0 |
| 0.7875 | 0 |
| 0.7881944444444445 | 0 |
| 0.7888888888888889 | 0 |
| 0.7895833333333333 | 0 |
| 0.7902777777777777 | 0 |
| 0.7909722222222223 | 0 |
| 0.7916666666666666 | 0 |
| 0.7923611111111111 | 0 |
| 0.7930555555555556 | 0 |
| 0.7937500000000001 | 0 |
| 0.7944444444444444 | 0 |
| 0.7951388888888888 | 0 |
| 0.7958333333333334 | 0 |
| 0.7965277777777778 | 0 |
| 0.7972222222222222 | 0 |
| 0.7979166666666666 | 0 |
| 0.7986111111111112 | 0 |
| 0.7993055555555556 | 0 |
| 0.7999999999999999 | 0 |
| 0.8006944444444444 | 0 |
| 0.8013888888888889 | 0 |
| 0.8020833333333334 | 0 |
| 0.8027777777777777 | 0 |
| 0.8034722222222223 | 0 |
| 0.8041666666666667 | 0 |
| 0.8048611111111111 | 0 |
| 0.8055555555555555 | 0 |
| 0.80625 | 0 |
| 0.8069444444444445 | 0 |
| 0.8076388888888889 | 0 |
| 0.8083333333333332 | 0 |
| 0.8090277777777778 | 0 |
| 0.8097222222222222 | 0 |
| 0.8104166666666667 | 0 |
| 0.811111111111111 | 0 |
| 0.8118055555555556 | 0 |
| 0.8125 | 0 |
| 0.8131944444444444 | 0 |
| 0.813888888888889 | 0 |
| 0.8145833333333333 | 0 |
| 0.8152777777777778 | 0 |
| 0.8159722222222222 | 0 |
| 0.8166666666666668 | 0 |
| 0.8173611111111111 | 0 |
| 0.8180555555555555 | 0 |
| 0.81875 | 0 |
| 0.8194444444444445 | 0 |
| 0.8201388888888889 | 0 |
| 0.8208333333333333 | 0 |
| 0.8215277777777777 | 0 |
| 0.8222222222222223 | 0 |
| 0.8229166666666666 | 0 |
| 0.8236111111111111 | 0 |
| 0.8243055555555556 | 0 |
| 0.8250000000000001 | 0 |
| 0.8256944444444444 | 0 |
| 0.8263888888888888 | 0 |
| 0.8270833333333334 | 0 |
| 0.8277777777777778 | 0 |
| 0.8284722222222222 | 0 |
| 0.8291666666666666 | 0 |
| 0.8298611111111112 | 0 |
| 0.8305555555555556 | 0 |
| 0.8312499999999999 | 0 |
| 0.8319444444444444 | 0 |
| 0.8326388888888889 | 0 |
| 0.8333333333333334 | 0 |
| 0.8340277777777777 | 0 |
| 0.8347222222222223 | 0 |
| 0.8354166666666667 | 0 |
| 0.8361111111111111 | 0 |
| 0.8368055555555555 | 0 |
| 0.8375 | 0 |
| 0.8381944444444445 | 0 |
| 0.8388888888888889 | 0 |
| 0.8395833333333332 | 0 |
| 0.8402777777777778 | 0 |
| 0.8409722222222222 | 0 |
| 0.8416666666666667 | 0 |
| 0.842361111111111 | 0 |
| 0.8430555555555556 | 0 |
| 0.84375 | 0 |
| 0.8444444444444444 | 0 |
| 0.845138888888889 | 0 |
| 0.8458333333333333 | 0 |
| 0.8465277777777778 | 0 |
| 0.8472222222222222 | 0 |
| 0.8479166666666668 | 0 |
| 0.8486111111111111 | 0 |
| 0.8493055555555555 | 0 |
| 0.85 | 0 |
| 0.8506944444444445 | 0 |
| 0.8513888888888889 | 0 |
| 0.8520833333333333 | 0 |
| 0.8527777777777777 | 0 |
| 0.8534722222222223 | 0 |
| 0.8541666666666666 | 0 |
| 0.8548611111111111 | 0 |
| 0.8555555555555556 | 0 |
| 0.8562500000000001 | 0 |
| 0.8569444444444444 | 0 |
| 0.8576388888888888 | 0 |
| 0.8583333333333334 | 0 |
| 0.8590277777777778 | 0 |
| 0.8597222222222222 | 0 |
| 0.8604166666666666 | 0 |
| 0.8611111111111112 | 0 |
| 0.8618055555555556 | 0 |
| 0.8624999999999999 | 0 |
| 0.8631944444444444 | 0 |
| 0.8638888888888889 | 0 |
| 0.8645833333333334 | 0 |
| 0.8652777777777777 | 0 |
| 0.8659722222222223 | 0 |
| 0.8666666666666667 | 0 |
| 0.8673611111111111 | 0 |
| 0.8680555555555555 | 0 |
| 0.86875 | 0 |
| 0.8694444444444445 | 0 |
| 0.8701388888888889 | 0 |
| 0.8708333333333332 | 0 |
| 0.8715277777777778 | 0 |
| 0.8722222222222222 | 0 |
| 0.8729166666666667 | 0 |
| 0.873611111111111 | 0 |
| 0.8743055555555556 | 0 |
| 0.875 | 0 |
| 0.8756944444444444 | 0 |
| 0.876388888888889 | 0 |
| 0.8770833333333333 | 0 |
| 0.8777777777777778 | 0 |
| 0.8784722222222222 | 0 |
| 0.8791666666666668 | 0 |
| 0.8798611111111111 | 0 |
| 0.8805555555555555 | 0 |
| 0.88125 | 0 |
| 0.8819444444444445 | 0 |
| 0.8826388888888889 | 0 |
| 0.8833333333333333 | 0 |
| 0.8840277777777777 | 0 |
| 0.8847222222222223 | 0 |
| 0.8854166666666666 | 0 |
| 0.8861111111111111 | 0 |
| 0.8868055555555556 | 0 |
| 0.8875000000000001 | 0 |
| 0.8881944444444444 | 0 |
| 0.8888888888888888 | 0 |
| 0.8895833333333334 | 0 |
| 0.8902777777777778 | 0 |
| 0.8909722222222222 | 0 |
| 0.8916666666666666 | 0 |
| 0.8923611111111112 | 0 |
| 0.8930555555555556 | 0 |
| 0.8937499999999999 | 0 |
| 0.8944444444444444 | 0 |
| 0.8951388888888889 | 0 |
| 0.8958333333333334 | 0 |
| 0.8965277777777777 | 0 |
| 0.8972222222222223 | 0 |
| 0.8979166666666667 | 0 |
| 0.8986111111111111 | 0 |
| 0.8993055555555555 | 0 |
| 0.9 | 0 |
| 0.9006944444444445 | 0 |
| 0.9013888888888889 | 0 |
| 0.9020833333333332 | 0 |
| 0.9027777777777778 | 0 |
| 0.9034722222222222 | 0 |
| 0.9041666666666667 | 0 |
| 0.904861111111111 | 0 |
| 0.9055555555555556 | 0 |
| 0.90625 | 0 |
| 0.9069444444444444 | 0 |
| 0.907638888888889 | 0 |
| 0.9083333333333333 | 0 |
| 0.9090277777777778 | 0 |
| 0.9097222222222222 | 0 |
| 0.9104166666666668 | 0 |
| 0.9111111111111111 | 0 |
| 0.9118055555555555 | 0 |
| 0.9125 | 0 |
| 0.9131944444444445 | 0 |
| 0.9138888888888889 | 0 |
| 0.9145833333333333 | 0 |
| 0.9152777777777777 | 0 |
| 0.9159722222222223 | 0 |
| 0.9166666666666666 | 0 |
| 0.9173611111111111 | 0 |
| 0.9180555555555556 | 0 |
| 0.9187500000000001 | 0 |
| 0.9194444444444444 | 0 |
| 0.9201388888888888 | 0 |
| 0.9208333333333334 | 0 |
| 0.9215277777777778 | 0 |
| 0.9222222222222222 | 0 |
| 0.9229166666666666 | 0 |
| 0.9236111111111112 | 0 |
| 0.9243055555555556 | 0 |
| 0.9249999999999999 | 0 |
| 0.9256944444444444 | 0 |
| 0.9263888888888889 | 0 |
| 0.9270833333333334 | 0 |
| 0.9277777777777777 | 0 |
| 0.9284722222222223 | 0 |
| 0.9291666666666667 | 0 |
| 0.9298611111111111 | 0 |
| 0.9305555555555555 | 0 |
| 0.93125 | 0 |
| 0.9319444444444445 | 0 |
| 0.9326388888888889 | 0 |
| 0.9333333333333332 | 0 |
| 0.9340277777777778 | 0 |
| 0.9347222222222222 | 0 |
| 0.9354166666666667 | 0 |
| 0.936111111111111 | 0 |
| 0.9368055555555556 | 0 |
| 0.9375 | 0 |
| 0.9381944444444444 | 0 |
| 0.938888888888889 | 0 |
| 0.9395833333333333 | 0 |
| 0.9402777777777778 | 0 |
| 0.9409722222222222 | 0 |
| 0.9416666666666668 | 0 |
| 0.9423611111111111 | 0 |
| 0.9430555555555555 | 0 |
| 0.94375 | 0 |
| 0.9444444444444445 | 0 |
| 0.9451388888888889 | 0 |
| 0.9458333333333333 | 0 |
| 0.9465277777777777 | 0 |
| 0.9472222222222223 | 0 |
| 0.9479166666666666 | 0 |
| 0.9486111111111111 | 0 |
| 0.9493055555555556 | 0 |
| 0.9500000000000001 | 0 |
| 0.9506944444444444 | 0 |
| 0.9513888888888888 | 0 |
| 0.9520833333333334 | 0 |
| 0.9527777777777778 | 0 |
| 0.9534722222222222 | 0 |
| 0.9541666666666666 | 0 |
| 0.9548611111111112 | 0 |
| 0.9555555555555556 | 0 |
| 0.9562499999999999 | 0 |
| 0.9569444444444444 | 0 |
| 0.9576388888888889 | 0 |
| 0.9583333333333334 | 0 |
| 0.9590277777777777 | 0 |
| 0.9597222222222223 | 0 |
| 0.9604166666666667 | 0 |
| 0.9611111111111111 | 0 |
| 0.9618055555555555 | 0 |
| 0.9625 | 0 |
| 0.9631944444444445 | 0 |
| 0.9638888888888889 | 0 |
| 0.9645833333333332 | 0 |
| 0.9652777777777778 | 0 |
| 0.9659722222222222 | 0 |
| 0.9666666666666667 | 0 |
| 0.967361111111111 | 0 |
| 0.9680555555555556 | 0 |
| 0.96875 | 0 |
| 0.9694444444444444 | 0 |
| 0.970138888888889 | 0 |
| 0.9708333333333333 | 0 |
| 0.9715277777777778 | 0 |
| 0.9722222222222222 | 0 |
| 0.9729166666666668 | 0 |
| 0.9736111111111111 | 0 |
| 0.9743055555555555 | 0 |
| 0.975 | 0 |
| 0.9756944444444445 | 0 |
| 0.9763888888888889 | 0 |
| 0.9770833333333333 | 0 |
| 0.9777777777777777 | 0 |
| 0.9784722222222223 | 0 |
| 0.9791666666666666 | 0 |
| 0.9798611111111111 | 0 |
| 0.9805555555555556 | 0 |
| 0.9812500000000001 | 0 |
| 0.9819444444444444 | 0 |
| 0.9826388888888888 | 0 |
| 0.9833333333333334 | 0 |
| 0.9840277777777778 | 0 |
| 0.9847222222222222 | 0 |
| 0.9854166666666666 | 0 |
| 0.9861111111111112 | 0 |
| 0.9868055555555556 | 0 |
| 0.9874999999999999 | 0 |
| 0.9881944444444444 | 0 |
| 0.9888888888888889 | 0 |
| 0.9895833333333334 | 0 |
| 0.9902777777777777 | 0 |
| 0.9909722222222223 | 0 |
| 0.9916666666666667 | 0 |
| 0.9923611111111111 | 0 |
| 0.9930555555555555 | 0 |
| 0.99375 | 0 |
| 0.9944444444444445 | 0 |
| 0.9951388888888889 | 0 |
| 0.9958333333333332 | 0 |
| 0.9965277777777778 | 0 |
| 0.9972222222222222 | 0 |
| 0.9979166666666667 | 0 |
| 0.998611111111111 | 0 |
| 0.9993055555555556 | 0 |